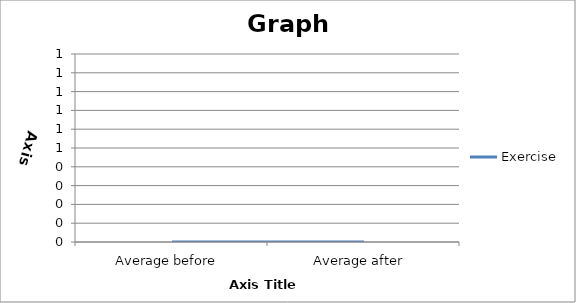
| Category | Exercise |
|---|---|
| Average before  | 0 |
| Average after  | 0 |